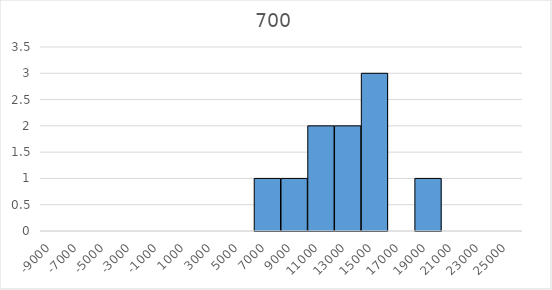
| Category | Series 0 | Series 1 |
|---|---|---|
| -9000.0 | 0 | 0 |
| -7000.0 | 0 | 0 |
| -5000.0 | 0 | 0 |
| -3000.0 | 0 | 0 |
| -1000.0 | 0 | 0 |
| 1000.0 | 0 | 0 |
| 3000.0 | 0 | 0 |
| 5000.0 | 0 | 0 |
| 7000.0 | 0 | 1 |
| 9000.0 | 0 | 1 |
| 11000.0 | 0 | 2 |
| 13000.0 | 0 | 2 |
| 15000.0 | 0 | 3 |
| 17000.0 | 0 | 0 |
| 19000.0 | 0 | 1 |
| 21000.0 | 0 | 0 |
| 23000.0 | 0 | 0 |
| 25000.0 | 0 | 0 |